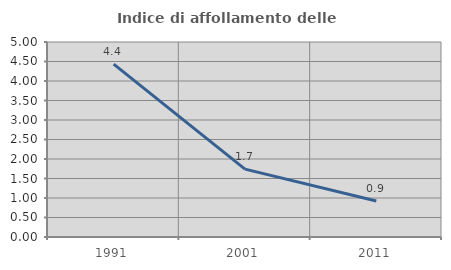
| Category | Indice di affollamento delle abitazioni  |
|---|---|
| 1991.0 | 4.431 |
| 2001.0 | 1.74 |
| 2011.0 | 0.923 |